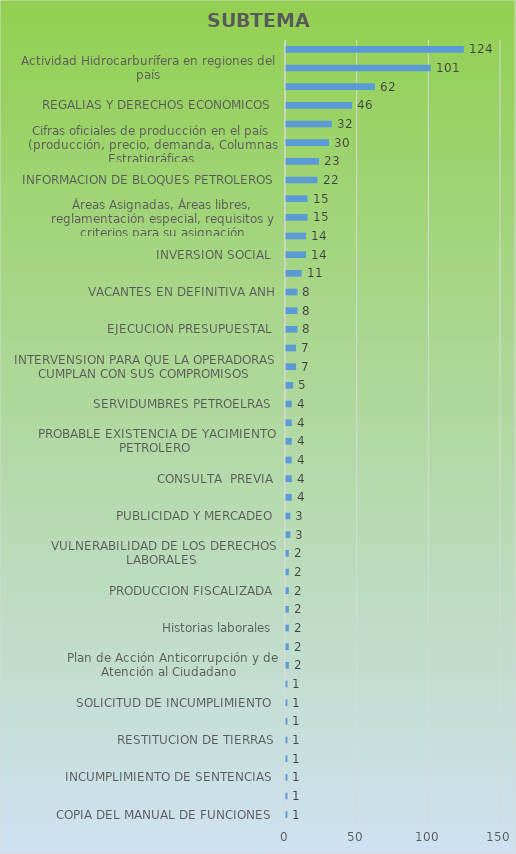
| Category | CANTIDAD |
|---|---|
| COPIA DEL MANUAL DE FUNCIONES  | 1 |
| INCENTIVO CERT | 1 |
| INCUMPLIMIENTO DE SENTENCIAS  | 1 |
| Información con fines Académicos (tesis de pregrado y postgrado) | 1 |
| RESTITUCION DE TIERRAS | 1 |
| RONDAS COLOMBIA | 1 |
| SOLICITUD DE INCUMPLIMIENTO  | 1 |
| VIGILANCIA DE ACTUACIONES ADMINISTRATIVAS  | 1 |
|  Plan de Acción Anticorrupción y de Atención al Ciudadano | 2 |
| Aplicación ControlDoc ANH - plan de continuidad de Negocios  | 2 |
| Historias laborales | 2 |
| LIQUIDACION DE CONTRATOS | 2 |
| PRODUCCION FISCALIZADA | 2 |
| RENDICION DE CUENTAS | 2 |
| VULNERABILIDAD DE LOS DERECHOS LABORALES  | 2 |
| CONCURSO DE MERITO COMISION NACIONAL DE SERVICIOS  | 3 |
| PUBLICIDAD Y MERCADEO | 3 |
| Certificación laboral Colaborador (funcionario o contratista) | 4 |
| CONSULTA  PREVIA | 4 |
| Intervención para que operador vincule personal | 4 |
| PROBABLE EXISTENCIA DE YACIMIENTO PETROLERO  | 4 |
| PROYECTO DE LEY  | 4 |
| SERVIDUMBRES PETROELRAS  | 4 |
| IMPACTOS Y PLANES DE MANEJO AMBIENTAL, LICENCIAS, COMPROMISOS E&P, NORMATIVIDAD CONTAMINACION  | 5 |
| INTERVENSION PARA QUE LA OPERADORAS CUMPLAN CON SUS COMPROMISOS | 7 |
| SOLICITUD DE REUNION | 7 |
| EJECUCION PRESUPUESTAL  | 8 |
| FRACKING | 8 |
| VACANTES EN DEFINITIVA ANH | 8 |
| DERRAME DE CRUDO  | 11 |
| INVERSION SOCIAL  | 14 |
| PROYECTO SISMICA EN COLOMBIA  | 14 |
| Áreas Asignadas, Áreas libres, reglamentación especial, requisitos y criterios para su asignación | 15 |
| CARTOGRAFIA ZONAS PETROLERAS | 15 |
| INFORMACION DE BLOQUES PETROLEROS | 22 |
| ESTADO DE POZOS | 23 |
| Cifras oficiales de producción en el país (producción, precio, demanda, Columnas Estratigráficas | 30 |
| COPIA DE CONTRATOS | 32 |
| REGALIAS Y DERECHOS ECONOMICOS  | 46 |
| CONTRATOS DE EXPLORACION Y EXPLOTACION  | 62 |
| Actividad Hidrocarburífera en regiones del país | 101 |
| Acompañamiento a comunidad en desarrollo de proyecto (ambiental, social) | 124 |